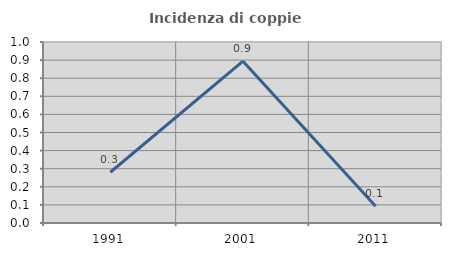
| Category | Incidenza di coppie miste |
|---|---|
| 1991.0 | 0.28 |
| 2001.0 | 0.894 |
| 2011.0 | 0.093 |